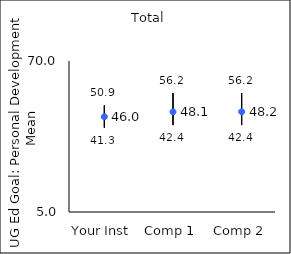
| Category | 25th percentile | 75th percentile | Mean |
|---|---|---|---|
| Your Inst | 41.3 | 50.9 | 46 |
| Comp 1 | 42.4 | 56.2 | 48.13 |
| Comp 2 | 42.4 | 56.2 | 48.16 |